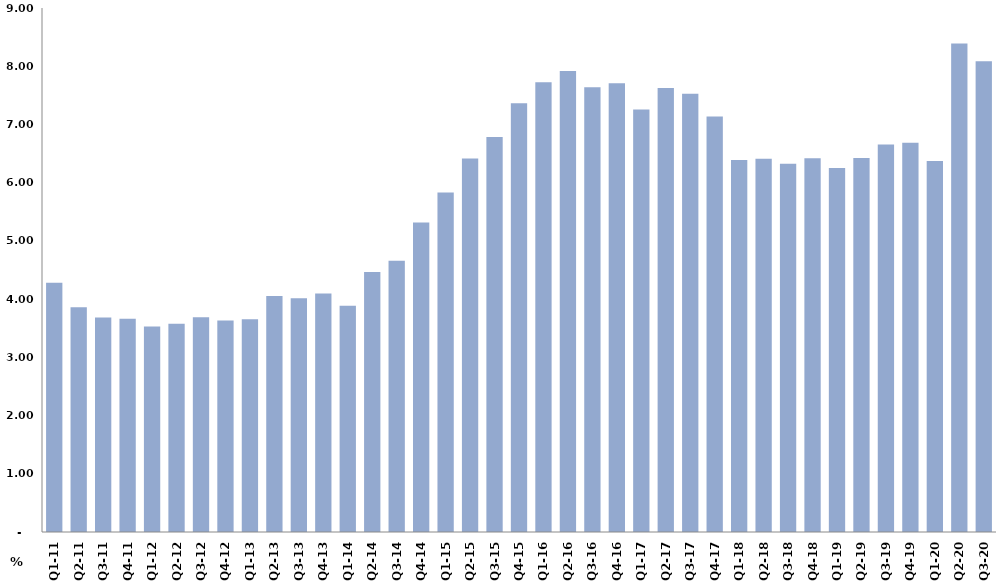
| Category | النسبة المئوية من الناتج المحلي الاجمالي
Percent of Total GDP |
|---|---|
| Q1-11 | 4.283 |
| Q2-11 | 3.859 |
| Q3-11 | 3.686 |
| Q4-11 | 3.662 |
| Q1-12 | 3.528 |
| Q2-12 | 3.578 |
| Q3-12 | 3.69 |
| Q4-12 | 3.634 |
| Q1-13 | 3.655 |
| Q2-13 | 4.054 |
| Q3-13 | 4.013 |
| Q4-13 | 4.096 |
| Q1-14 | 3.887 |
| Q2-14 | 4.465 |
| Q3-14 | 4.66 |
| Q4-14 | 5.318 |
| Q1-15 | 5.83 |
| Q2-15 | 6.416 |
| Q3-15 | 6.784 |
| Q4-15 | 7.366 |
| Q1-16 | 7.726 |
| Q2-16 | 7.919 |
| Q3-16 | 7.637 |
| Q4-16 | 7.706 |
| Q1-17 | 7.258 |
| Q2-17 | 7.627 |
| Q3-17 | 7.527 |
| Q4-17 | 7.138 |
| Q1-18 | 6.39 |
| Q2-18 | 6.411 |
| Q3-18 | 6.324 |
| Q4-18 | 6.42 |
| Q1-19 | 6.251 |
| Q2-19 | 6.422 |
| Q3-19 | 6.655 |
| Q4-19 | 6.686 |
| Q1-20 | 6.372 |
| Q2-20 | 8.391 |
| Q3-20 | 8.087 |